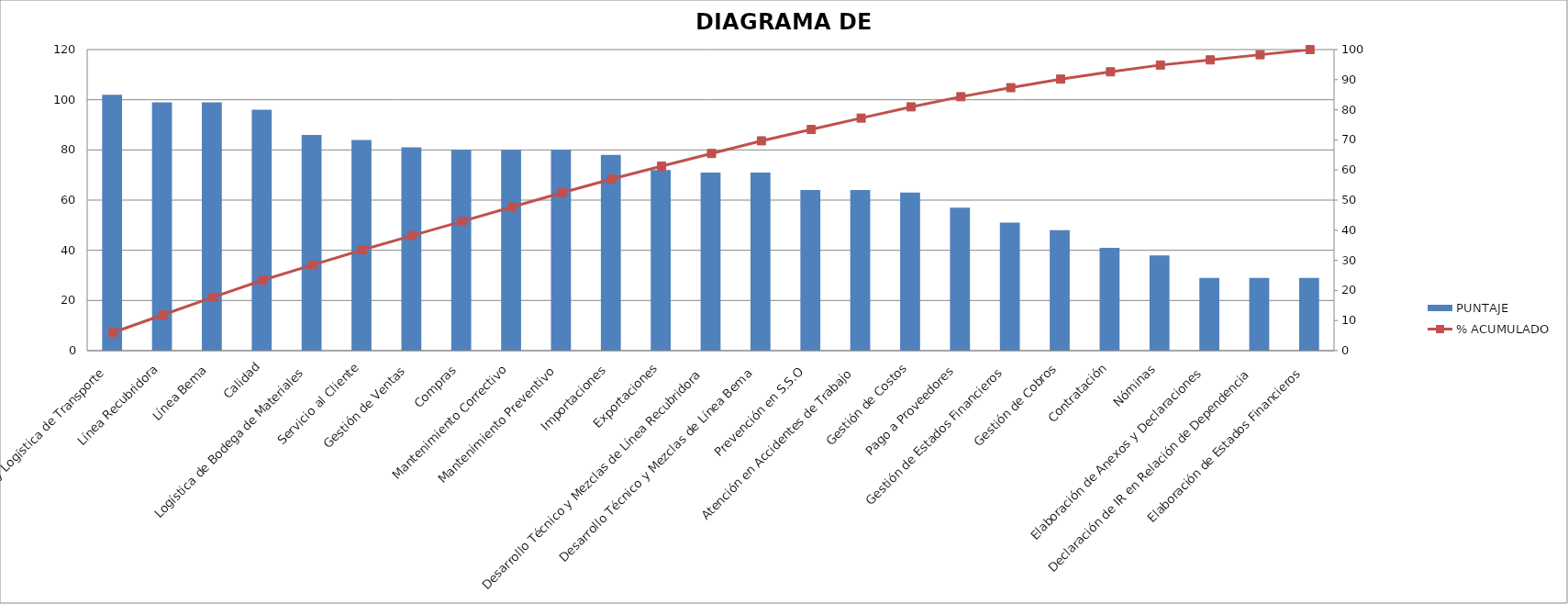
| Category | PUNTAJE |
|---|---|
| Ventas y Logística de Transporte | 102 |
| Línea Recubridora | 99 |
| Línea Bema | 99 |
| Calidad | 96 |
| Logística de Bodega de Materiales | 86 |
| Servicio al Cliente | 84 |
| Gestión de Ventas | 81 |
| Compras | 80 |
| Mantenimiento Correctivo | 80 |
| Mantenimiento Preventivo | 80 |
| Importaciones | 78 |
| Exportaciones | 72 |
| Desarrollo Técnico y Mezclas de Línea Recubridora | 71 |
| Desarrollo Técnico y Mezclas de Línea Bema | 71 |
| Prevención en S.S.O | 64 |
| Atención en Accidentes de Trabajo | 64 |
| Gestión de Costos | 63 |
| Pago a Proveedores | 57 |
| Gestión de Estados Financieros | 51 |
| Gestión de Cobros | 48 |
| Contratación | 41 |
| Nóminas | 38 |
| Elaboración de Anexos y Declaraciones | 29 |
| Declaración de IR en Relación de Dependencia | 29 |
| Elaboración de Estados Financieros | 29 |